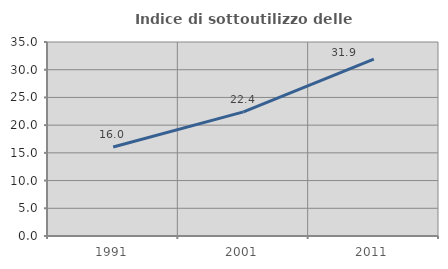
| Category | Indice di sottoutilizzo delle abitazioni  |
|---|---|
| 1991.0 | 16.046 |
| 2001.0 | 22.385 |
| 2011.0 | 31.893 |